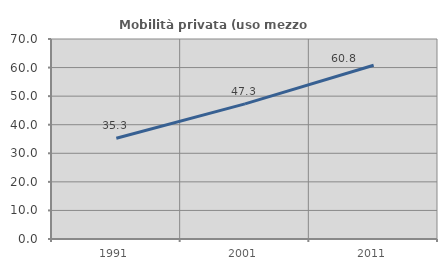
| Category | Mobilità privata (uso mezzo privato) |
|---|---|
| 1991.0 | 35.263 |
| 2001.0 | 47.291 |
| 2011.0 | 60.804 |